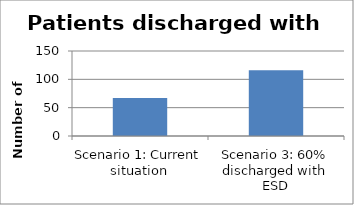
| Category | Number of patients |
|---|---|
| Scenario 1: Current situation | 67 |
| Scenario 3: 60% discharged with ESD | 116 |